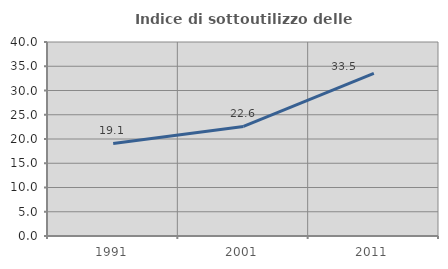
| Category | Indice di sottoutilizzo delle abitazioni  |
|---|---|
| 1991.0 | 19.079 |
| 2001.0 | 22.592 |
| 2011.0 | 33.514 |